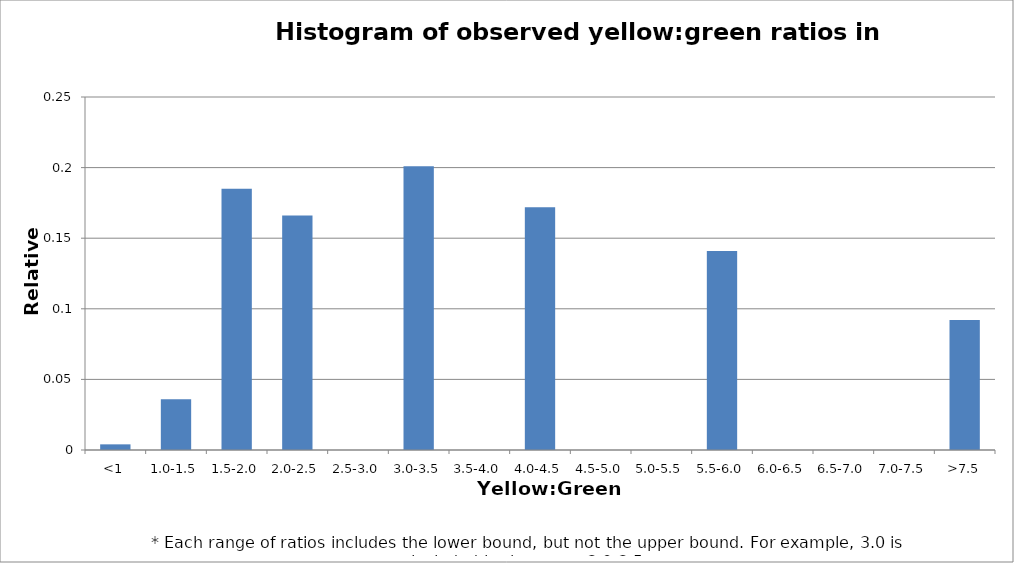
| Category | Series 1 |
|---|---|
| <1 | 0.004 |
| 1.0-1.5 | 0.036 |
| 1.5-2.0 | 0.185 |
| 2.0-2.5 | 0.166 |
| 2.5-3.0 | 0 |
| 3.0-3.5 | 0.201 |
| 3.5-4.0 | 0 |
| 4.0-4.5 | 0.172 |
| 4.5-5.0 | 0 |
| 5.0-5.5 | 0 |
| 5.5-6.0 | 0.141 |
| 6.0-6.5 | 0 |
| 6.5-7.0 | 0 |
| 7.0-7.5 | 0 |
| >7.5 | 0.092 |